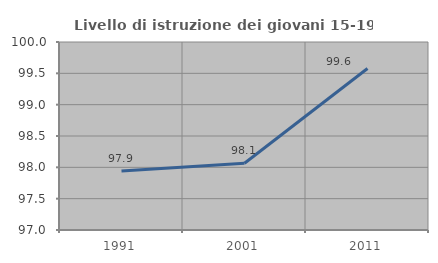
| Category | Livello di istruzione dei giovani 15-19 anni |
|---|---|
| 1991.0 | 97.941 |
| 2001.0 | 98.065 |
| 2011.0 | 99.578 |